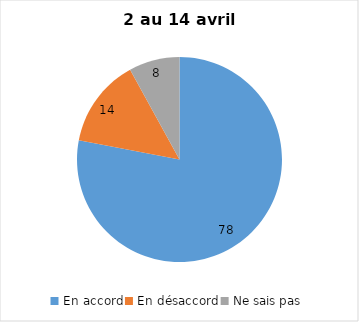
| Category | Series 0 |
|---|---|
| En accord | 78 |
| En désaccord | 14 |
| Ne sais pas | 8 |